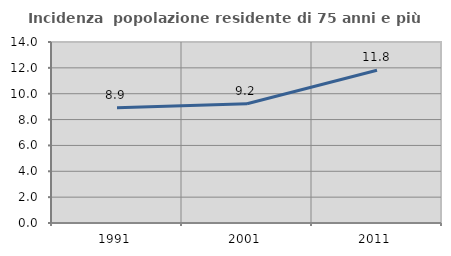
| Category | Incidenza  popolazione residente di 75 anni e più |
|---|---|
| 1991.0 | 8.919 |
| 2001.0 | 9.227 |
| 2011.0 | 11.819 |